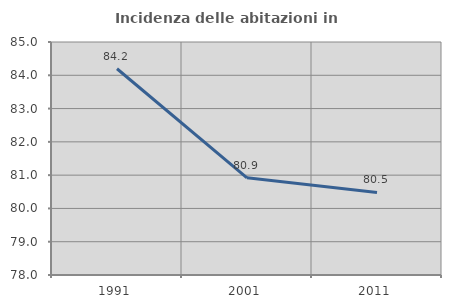
| Category | Incidenza delle abitazioni in proprietà  |
|---|---|
| 1991.0 | 84.196 |
| 2001.0 | 80.92 |
| 2011.0 | 80.48 |